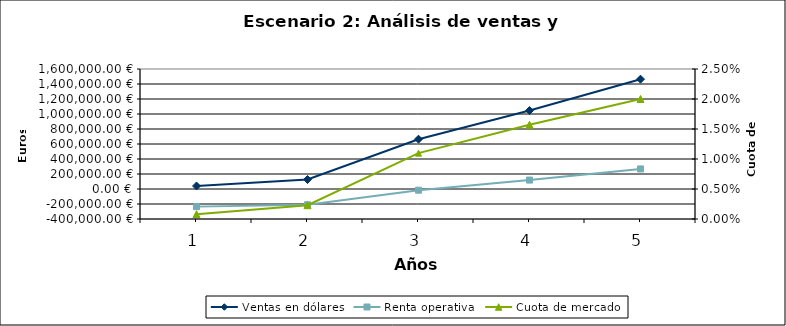
| Category | Ventas en dólares | Renta operativa |
|---|---|---|
| 0 | 40000 | -235000 |
| 1 | 126474.463 | -210072.076 |
| 2 | 663990.93 | -16228.401 |
| 3 | 1045785.714 | 118987.893 |
| 4 | 1464100 | 267660.298 |